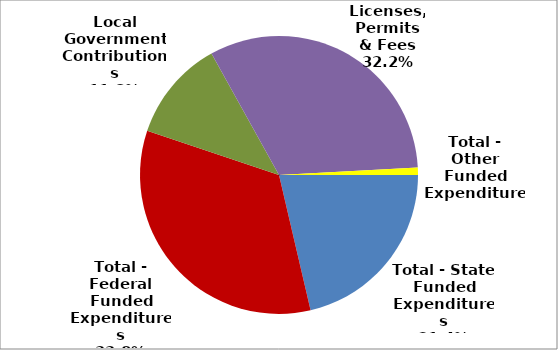
| Category | Series 0 |
|---|---|
| Total - State Funded Expenditures | 470357 |
| Total - Federal Funded Expenditures | 744532 |
| Local Government Contributions | 259501 |
| Licenses, Permits & Fees | 709484 |
| Total - Other Funded Expenditures | 19138 |